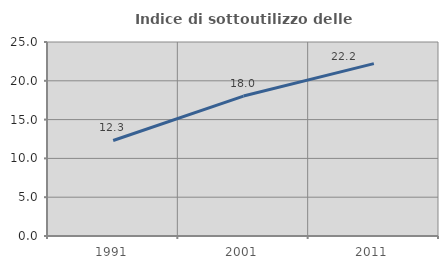
| Category | Indice di sottoutilizzo delle abitazioni  |
|---|---|
| 1991.0 | 12.31 |
| 2001.0 | 18.035 |
| 2011.0 | 22.208 |